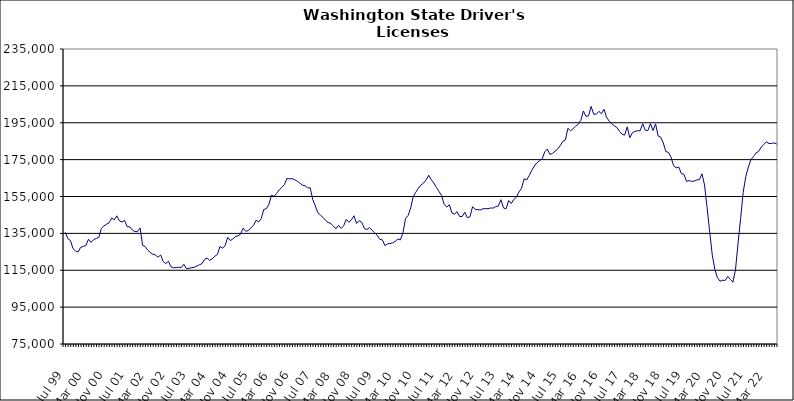
| Category | Series 0 |
|---|---|
| Jul 99 | 135560 |
| Aug 99 | 132182 |
| Sep 99 | 131104 |
| Oct 99 | 126694 |
| Nov 99 | 125425 |
| Dec 99 | 124927 |
| Jan 00 | 127499 |
| Feb 00 | 127927 |
| Mar 00 | 128547 |
| Apr 00 | 131834 |
| May 00 | 130120 |
| Jun 00 | 131595 |
| Jul 00 | 132236 |
| Aug 00 | 132819 |
| Sep 00 | 137711 |
| Oct 00 | 139063 |
| Nov 00 | 139952 |
| Dec 00 | 140732 |
| Jan 01 | 143338 |
| Feb 01 | 142359 |
| Mar 01 | 144523 |
| Apr 01 | 141758 |
| May 01 | 141135 |
| Jun 01 | 142064 |
| Jul 01 | 138646 |
| Aug 01 | 138530 |
| Sep 01 | 136784 |
| Oct 01 | 135996 |
| Nov 01 | 135917 |
| Dec 01 | 137940 |
| Jan 02 | 128531 |
| Feb 02 | 127848 |
| Mar 02 | 125876 |
| Apr 02 | 124595 |
| May 02 | 123660 |
| Jun 02 | 123282 |
| Jul 02 | 122089 |
| Aug 02 | 123279 |
| Sep 02 | 119727 |
| Oct 02 | 118588 |
| Nov 02 | 119854 |
| Dec 02 | 116851 |
| Jan 03 | 116407 |
| Feb 03 | 116382 |
| Mar 03 | 116648 |
| Apr 03 | 116471 |
| May 03 | 118231 |
| Jun 03 | 115831 |
| Jul 03 | 116082 |
| Aug 03 | 116341 |
| Sep 03 | 116653 |
| Oct 03 | 117212 |
| Nov 03 | 117962 |
| Dec 03 | 118542 |
| Jan 04 | 120817 |
| Feb 04 | 121617 |
| Mar 04 | 120369 |
| Apr 04 | 121200 |
| May 04 | 122609 |
| Jun 04 | 123484 |
| Jul 04 | 127844 |
| Aug 04 | 127025 |
| Sep 04 | 128273 |
| Oct 04 | 132853 |
| Nov 04 | 131106 |
| Dec 04 | 131935 |
| Jan 05 | 133205 |
| Feb 05 | 133736 |
| Mar 05 | 134528 |
| Apr 05 | 137889 |
| May 05 | 136130 |
| Jun 05 | 136523 |
| Jul 05 | 137997 |
| Aug 05 | 139294 |
| Sep 05 | 142140 |
| Oct 05 | 141192 |
| Nov 05 | 142937 |
| Dec 05 | 148013 |
| Jan 06 | 148341 |
| Feb 06 | 150744 |
| Mar 06 | 155794 |
| Apr 06 | 154984 |
| May 06 | 156651 |
| Jun 06 | 158638 |
| Jul 06 | 159911 |
| Aug 06 | 161445 |
| Sep 06 | 164852 |
| Oct 06 | 164570 |
| Nov 06 | 164679 |
| Dec 06 | 164127 |
| Jan 07 | 163271 |
| Feb 07 | 162273 |
| Mar 07 | 161140 |
| Apr 07 | 160860 |
| May 07 | 159633 |
| Jun 07 | 159724 |
| Jul 07 | 153303 |
| Aug 07 | 149939 |
| Sep 07 | 146172 |
| Oct 07 | 144876 |
| Nov 07 | 143613 |
| Dec 07 | 142022 |
| Jan 08 | 140909 |
| Feb 08 | 140368 |
| Mar 08 | 138998 |
| Apr 08 | 137471 |
| May 08 | 139453 |
| Jun 08 | 137680 |
| Jul 08 | 139120 |
| Aug 08 | 142612 |
| Sep-08 | 141071 |
| Oct 08 | 142313 |
| Nov 08 | 144556 |
| Dec 08 | 140394 |
| Jan 09 | 141903 |
| Feb 09 | 141036 |
| Mar 09 | 137751 |
| Apr 09 | 137060 |
| May 09 | 138101 |
| Jun 09 | 136739 |
| Jul 09 | 135317 |
| Aug 09 | 134020 |
| Sep 09 | 131756 |
| Oct 09 | 131488 |
| Nov 09 | 128370 |
| Dec 09 | 129323 |
| Jan 10 | 129531 |
| Feb 10 | 129848 |
| Mar 10 | 130654 |
| Apr 10 | 131929 |
| May 10 | 131429 |
| Jun 10 | 135357 |
| Jul 10 | 143032 |
| Aug 10 | 144686 |
| Sep 10 | 148856 |
| Oct 10 | 155042 |
| Nov 10 | 157328 |
| Dec 10 | 159501 |
| Jan 11 | 161221 |
| Feb 11 | 162312 |
| Mar 11 | 163996 |
| Apr 11 | 166495 |
| May 11 | 164040 |
| Jun 11 | 162324 |
| Jul 11 | 159862 |
| Aug 11 | 157738 |
| Sep 11 | 155430 |
| Oct 11 | 150762 |
| Nov 11 | 149255 |
| Dec 11 | 150533 |
| Jan 12 | 146068 |
| Feb 12 | 145446 |
| Mar 12 | 146788 |
| Apr 12 | 144110 |
| May 12 | 144162 |
| Jun 12 | 146482 |
| Jul 12 | 143445 |
| Aug 12 | 143950 |
| Sep 12 | 149520 |
| Oct 12 | 148033 |
| Nov 12 | 147926 |
| Dec 12 | 147674 |
| Jan 13 | 148360 |
| Feb-13 | 148388 |
| Mar-13 | 148414 |
| Apr 13 | 148749 |
| May 13 | 148735 |
| Jun-13 | 149521 |
| Jul 13 | 149837 |
| Aug 13 | 153252 |
| Sep 13 | 148803 |
| Oct 13 | 148315 |
| Nov 13 | 152804 |
| Dec 13 | 151209 |
| Jan 14 | 153357 |
| Feb-14 | 154608 |
| Mar 14 | 157479 |
| Apr 14 | 159441 |
| May 14 | 164591 |
| Jun 14 | 163995 |
| Jul-14 | 166411 |
| Aug-14 | 169272 |
| Sep 14 | 171565 |
| Oct 14 | 173335 |
| Nov 14 | 174406 |
| Dec 14 | 175302 |
| Jan 15 | 179204 |
| Feb 15 | 180737 |
| Mar 15 | 177810 |
| Apr-15 | 178331 |
| May 15 | 179601 |
| Jun-15 | 180729 |
| Jul 15 | 182540 |
| Aug 15 | 184924 |
| Sep 15 | 185620 |
| Oct 15 | 192002 |
| Nov 15 | 190681 |
| Dec 15 | 191795 |
| Jan 16 | 193132 |
| Feb 16 | 194206 |
| Mar 16 | 196319 |
| Apr 16 | 201373 |
| May 16 | 198500 |
| Jun 16 | 198743 |
| Jul 16 | 203841 |
| Aug 16 | 199630 |
| Sep 16 | 199655 |
| Oct 16 | 201181 |
| Nov 16 | 199888 |
| Dec 16 | 202304 |
| Jan 17 | 197977 |
| Feb 17 | 195889 |
| Mar 17 | 194438 |
| Apr 17 | 193335 |
| May 17 | 192430 |
| Jun 17 | 190298 |
| Jul 17 | 188832 |
| Aug 17 | 188264 |
| Sep 17 | 192738 |
| Oct 17 | 186856 |
| Nov 17 | 189537 |
| Dec 17 | 190341 |
| Jan 18 | 190670 |
| Feb 18 | 190645 |
| Mar 18 | 194476 |
| Apr 18 | 190971 |
| May 18 | 190707 |
| Jun 18 | 194516 |
| Jul 18 | 190783 |
| Aug 18 | 194390 |
| Sep 18 | 187831 |
| Oct 18 | 187188 |
| Nov 18 | 184054 |
| Dec 18 | 179347 |
| Jan 19 | 178958 |
| Feb 19 | 176289 |
| Mar 19 | 171747 |
| Apr 19 | 170532 |
| May 19 | 170967 |
| Jun 19 | 167444 |
| Jul 19 | 167059 |
| Aug 19 | 163194 |
| Sep 19 | 163599 |
| Oct 19 | 163212 |
| Nov 19 | 163388 |
| Dec 19 | 164024 |
| Jan 20 | 164114 |
| Feb 20 | 167320 |
| Mar 20 | 161221 |
| Apr 20 | 148866 |
| May 20 | 135821 |
| Jun 20 | 123252 |
| Jul 20 | 115526 |
| Aug 20 | 110940 |
| Sep 20 | 109099 |
| Oct 20 | 109566 |
| Nov 20 | 109488 |
| Dec 20 | 111658 |
| Jan 21 | 110070 |
| Feb 21 | 108491 |
| Mar 21 | 115176 |
| Apr 21 | 129726 |
| May 21 | 143052 |
| Jun 21 | 157253 |
| Jul 21 | 165832 |
| Aug 21 | 170937 |
| Sep 21 | 175042 |
| Oct 21 | 176696 |
| Nov 21 | 178677 |
| Dec 21 | 179501 |
| Jan 22 | 181825 |
| Feb 22 | 183258 |
| Mar 22 | 184618 |
| Apr 22 | 183710 |
| May 22 | 183784 |
| Jun 22 | 184101 |
| Jul 22 | 183443 |